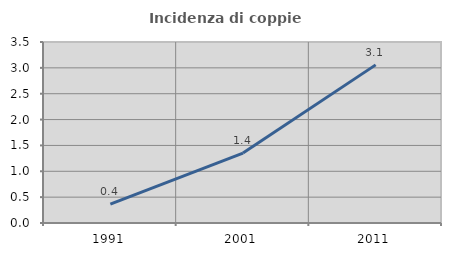
| Category | Incidenza di coppie miste |
|---|---|
| 1991.0 | 0.363 |
| 2001.0 | 1.351 |
| 2011.0 | 3.058 |